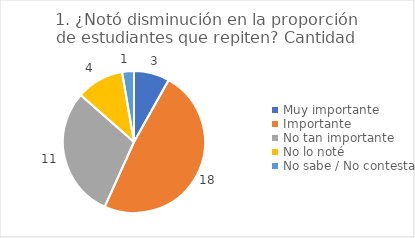
| Category | 1. ¿Notó disminución en la proporción de estudiantes que repiten? |
|---|---|
| Muy importante  | 0.081 |
| Importante  | 0.486 |
| No tan importante  | 0.297 |
| No lo noté  | 0.108 |
| No sabe / No contesta | 0.027 |